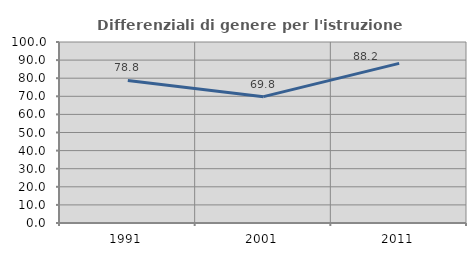
| Category | Differenziali di genere per l'istruzione superiore |
|---|---|
| 1991.0 | 78.783 |
| 2001.0 | 69.801 |
| 2011.0 | 88.213 |